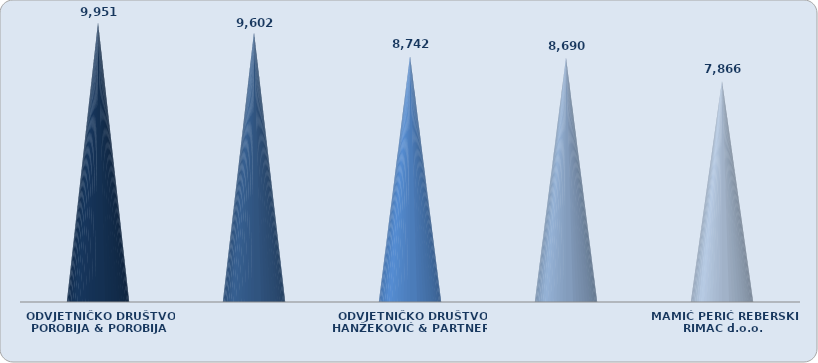
| Category | Dobit razdoblja |
|---|---|
| ODVJETNIČKO DRUŠTVO POROBIJA & POROBIJA j.t.d. | 9951.055 |
| GRGIĆ & PARTNERI ODVJETNIČKO DRUŠTVO d.o.o. | 9601.558 |
| ODVJETNIČKO DRUŠTVO HANŽEKOVIĆ & PARTNERI d.o.o. | 8742.395 |
| WOLF THEISS RECHTSANWAELTE GMBH & CO KG - Podružnica Zagreb | 8690.247 |
| MAMIĆ PERIĆ REBERSKI RIMAC d.o.o. | 7865.585 |